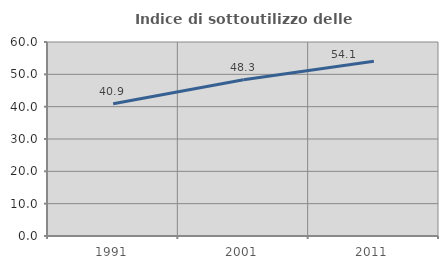
| Category | Indice di sottoutilizzo delle abitazioni  |
|---|---|
| 1991.0 | 40.892 |
| 2001.0 | 48.339 |
| 2011.0 | 54.064 |